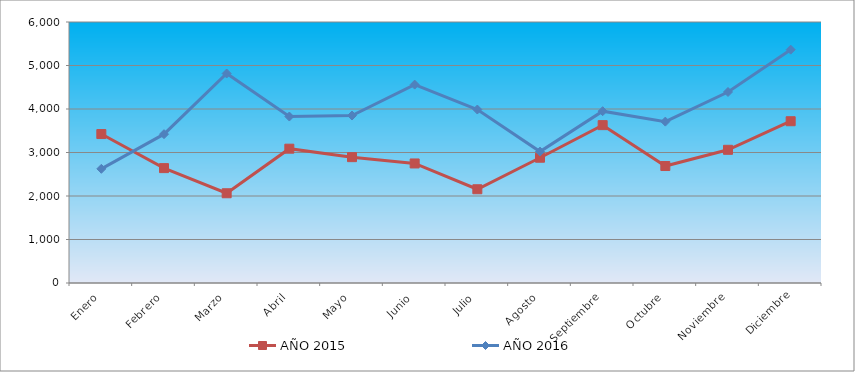
| Category | AÑO 2015 | AÑO 2016 |
|---|---|---|
| Enero | 3424 | 2625 |
| Febrero | 2641 | 3421 |
| Marzo | 2063 | 4816 |
| Abril | 3088 | 3827 |
| Mayo | 2893 | 3850 |
| Junio | 2748 | 4561 |
| Julio | 2155 | 3988 |
| Agosto | 2880 | 3021 |
| Septiembre | 3629 | 3950 |
| Octubre | 2689 | 3710 |
| Noviembre | 3062 | 4391 |
| Diciembre | 3719 | 5364 |